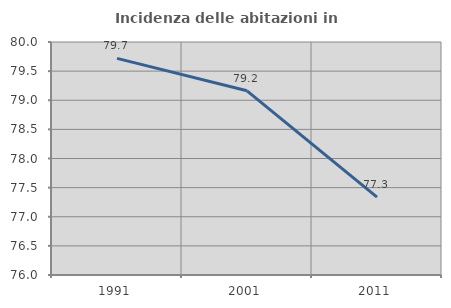
| Category | Incidenza delle abitazioni in proprietà  |
|---|---|
| 1991.0 | 79.719 |
| 2001.0 | 79.162 |
| 2011.0 | 77.337 |